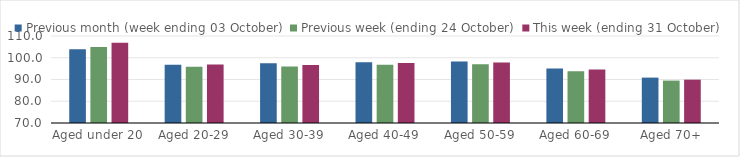
| Category | Previous month (week ending 03 October) | Previous week (ending 24 October) | This week (ending 31 October) |
|---|---|---|---|
| Aged under 20 | 103.88 | 104.96 | 106.9 |
| Aged 20-29 | 96.79 | 95.83 | 96.87 |
| Aged 30-39 | 97.48 | 95.99 | 96.66 |
| Aged 40-49 | 97.93 | 96.78 | 97.63 |
| Aged 50-59 | 98.31 | 96.99 | 97.85 |
| Aged 60-69 | 95.05 | 93.79 | 94.64 |
| Aged 70+ | 90.87 | 89.5 | 89.93 |